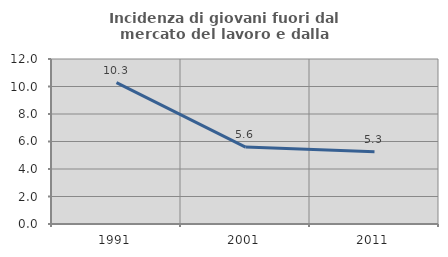
| Category | Incidenza di giovani fuori dal mercato del lavoro e dalla formazione  |
|---|---|
| 1991.0 | 10.28 |
| 2001.0 | 5.594 |
| 2011.0 | 5.263 |